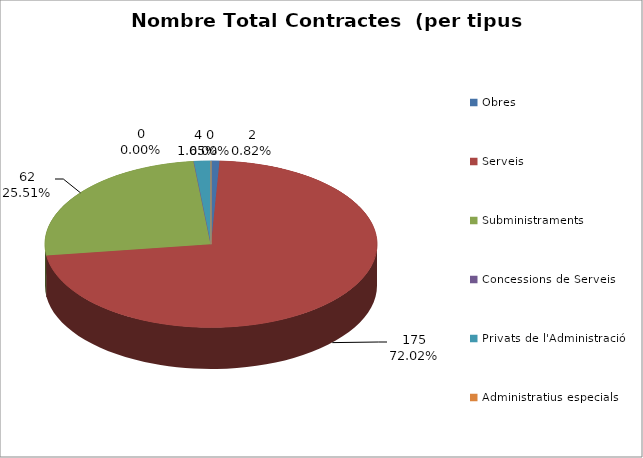
| Category | Nombre Total Contractes |
|---|---|
| Obres | 2 |
| Serveis | 175 |
| Subministraments | 62 |
| Concessions de Serveis | 0 |
| Privats de l'Administració | 4 |
| Administratius especials | 0 |